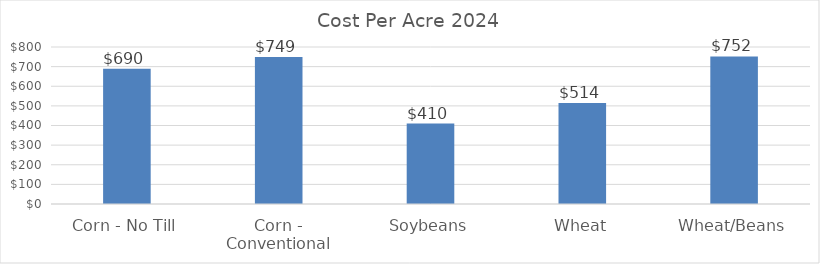
| Category | 2024 |
|---|---|
| Corn - No Till | 689.636 |
| Corn - Conventional | 748.854 |
| Soybeans | 409.87 |
| Wheat | 514.094 |
| Wheat/Beans | 752.057 |